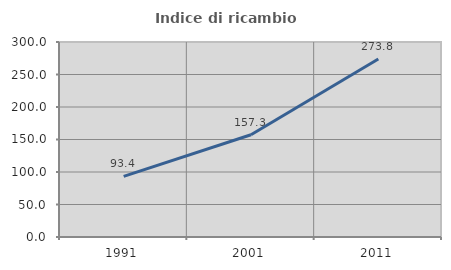
| Category | Indice di ricambio occupazionale  |
|---|---|
| 1991.0 | 93.382 |
| 2001.0 | 157.297 |
| 2011.0 | 273.81 |